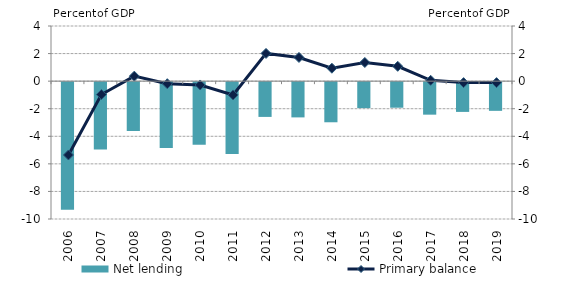
| Category | Net lending |
|---|---|
| 2006.0 | -9.252 |
| 2007.0 | -4.887 |
| 2008.0 | -3.544 |
| 2009.0 | -4.778 |
| 2010.0 | -4.541 |
| 2011.0 | -5.211 |
| 2012.0 | -2.522 |
| 2013.0 | -2.557 |
| 2014.0 | -2.911 |
| 2015.0 | -1.886 |
| 2016.0 | -1.855 |
| 2017.0 | -2.359 |
| 2018.0 | -2.159 |
| 2019.0 | -2.082 |